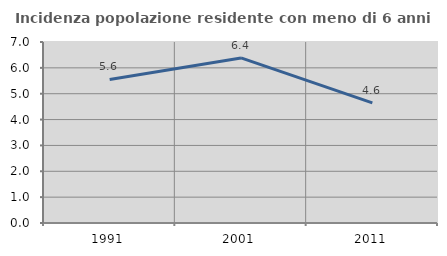
| Category | Incidenza popolazione residente con meno di 6 anni |
|---|---|
| 1991.0 | 5.552 |
| 2001.0 | 6.383 |
| 2011.0 | 4.648 |